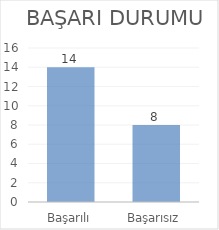
| Category | Series 0 |
|---|---|
| Başarılı | 14 |
| Başarısız | 8 |